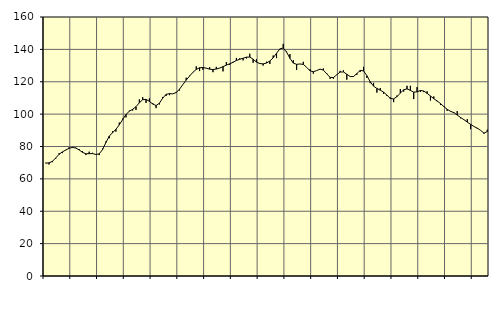
| Category | Piggar | Series 1 |
|---|---|---|
| nan | 70 | 69.7 |
| 87.0 | 68.9 | 69.88 |
| 87.0 | 70.3 | 70.83 |
| 87.0 | 72.5 | 72.91 |
| nan | 75.9 | 75.14 |
| 88.0 | 75.9 | 76.68 |
| 88.0 | 77.7 | 77.84 |
| 88.0 | 79.5 | 78.91 |
| nan | 79.7 | 79.4 |
| 89.0 | 79.3 | 79.06 |
| 89.0 | 78.4 | 77.86 |
| 89.0 | 77.2 | 76.39 |
| nan | 74.7 | 75.53 |
| 90.0 | 76.8 | 75.56 |
| 90.0 | 76.1 | 75.63 |
| 90.0 | 75.2 | 75.07 |
| nan | 74.7 | 75.44 |
| 91.0 | 78.8 | 78.09 |
| 91.0 | 83.1 | 82.44 |
| 91.0 | 85.1 | 86.37 |
| nan | 89.4 | 88.59 |
| 92.0 | 89.2 | 90.64 |
| 92.0 | 94.8 | 93.35 |
| 92.0 | 97.2 | 96.59 |
| nan | 98 | 99.78 |
| 93.0 | 102.1 | 101.79 |
| 93.0 | 102.2 | 102.98 |
| 93.0 | 102.6 | 104.58 |
| nan | 109.1 | 107.02 |
| 94.0 | 110.5 | 108.91 |
| 94.0 | 106.9 | 109.1 |
| 94.0 | 109.7 | 107.88 |
| nan | 106.8 | 106.23 |
| 95.0 | 103.7 | 105.3 |
| 95.0 | 106 | 106.74 |
| 95.0 | 110.6 | 109.98 |
| nan | 111.2 | 112.22 |
| 96.0 | 111.7 | 112.66 |
| 96.0 | 112.5 | 112.52 |
| 96.0 | 113.7 | 113.34 |
| nan | 114.6 | 115.37 |
| 97.0 | 118.2 | 118.25 |
| 97.0 | 122.5 | 121.02 |
| 97.0 | 123.7 | 123.5 |
| nan | 125.7 | 125.83 |
| 98.0 | 129.5 | 127.63 |
| 98.0 | 126.6 | 128.64 |
| 98.0 | 127.4 | 128.81 |
| nan | 128.3 | 128.39 |
| 99.0 | 129 | 127.77 |
| 99.0 | 125.9 | 127.55 |
| 99.0 | 129.2 | 127.85 |
| nan | 128.4 | 128.47 |
| 0.0 | 126.4 | 129.35 |
| 0.0 | 132.2 | 130.27 |
| 0.0 | 130.4 | 131.07 |
| nan | 132.3 | 132 |
| 1.0 | 134.7 | 133.13 |
| 1.0 | 134.5 | 133.89 |
| 1.0 | 133.2 | 134.5 |
| nan | 134.4 | 135.2 |
| 2.0 | 137.3 | 135.27 |
| 2.0 | 131.7 | 133.92 |
| 2.0 | 133.9 | 132.14 |
| nan | 131 | 131.25 |
| 3.0 | 130 | 131.03 |
| 3.0 | 132.4 | 131.55 |
| 3.0 | 131 | 132.81 |
| nan | 136.2 | 134.78 |
| 4.0 | 134.6 | 137.57 |
| 4.0 | 140.1 | 140.3 |
| 4.0 | 143.4 | 140.82 |
| nan | 138.7 | 138.34 |
| 5.0 | 137.1 | 134.5 |
| 5.0 | 133.3 | 131.55 |
| 5.0 | 127.3 | 130.76 |
| nan | 131 | 130.98 |
| 6.0 | 132.3 | 130.7 |
| 6.0 | 128.9 | 128.91 |
| 6.0 | 127.7 | 126.77 |
| nan | 125 | 126.16 |
| 7.0 | 127 | 126.9 |
| 7.0 | 127.9 | 127.79 |
| 7.0 | 128.2 | 127.18 |
| nan | 125.3 | 124.92 |
| 8.0 | 121.8 | 122.73 |
| 8.0 | 121.8 | 122.56 |
| 8.0 | 124.4 | 124.29 |
| nan | 126.7 | 125.99 |
| 9.0 | 127.1 | 126.05 |
| 9.0 | 121.3 | 124.65 |
| 9.0 | 123.4 | 123.26 |
| nan | 123.4 | 123.2 |
| 10.0 | 124.2 | 125.03 |
| 10.0 | 126.1 | 127 |
| 10.0 | 129.2 | 126.73 |
| nan | 122.4 | 123.74 |
| 11.0 | 119.1 | 119.98 |
| 11.0 | 119.3 | 117.27 |
| 11.0 | 113.3 | 115.84 |
| nan | 116.1 | 114.78 |
| 12.0 | 112.5 | 113.58 |
| 12.0 | 111.2 | 111.73 |
| 12.0 | 110.4 | 109.67 |
| nan | 107.4 | 109.4 |
| 13.0 | 111.5 | 110.8 |
| 13.0 | 115.5 | 113 |
| 13.0 | 113.9 | 115.07 |
| nan | 117.5 | 115.6 |
| 14.0 | 117.5 | 114.65 |
| 14.0 | 109.3 | 113.6 |
| 14.0 | 116.7 | 113.75 |
| nan | 113.7 | 114.61 |
| 15.0 | 113.6 | 114.29 |
| 15.0 | 114.1 | 112.81 |
| 15.0 | 108.4 | 111.23 |
| nan | 110.9 | 109.53 |
| 16.0 | 107.9 | 108.15 |
| 16.0 | 105.6 | 106.52 |
| 16.0 | 105 | 104.69 |
| nan | 102 | 103 |
| 17.0 | 101.5 | 101.72 |
| 17.0 | 101.3 | 100.91 |
| 17.0 | 101.9 | 99.43 |
| nan | 97.4 | 97.92 |
| 18.0 | 96.7 | 96.59 |
| 18.0 | 96.9 | 95.1 |
| 18.0 | 90.7 | 93.68 |
| nan | 92.4 | 92.36 |
| 19.0 | 90.9 | 91.36 |
| 19.0 | 89.9 | 89.93 |
| 19.0 | 87.9 | 88.29 |
| nan | 90.4 | 89.25 |